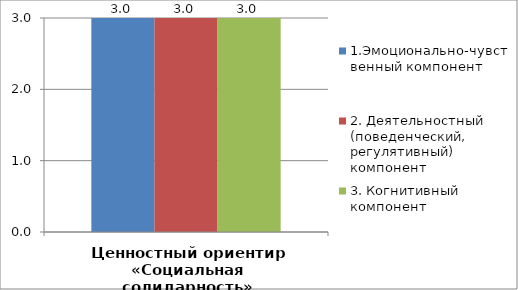
| Category | 1.Эмоционально-чувственный компонент | 2. Деятельностный (поведенческий, регулятивный) компонент | 3. Когнитивный компонент |
|---|---|---|---|
| Ценностный ориентир «Социальная солидарность» | 3 | 3 | 3 |